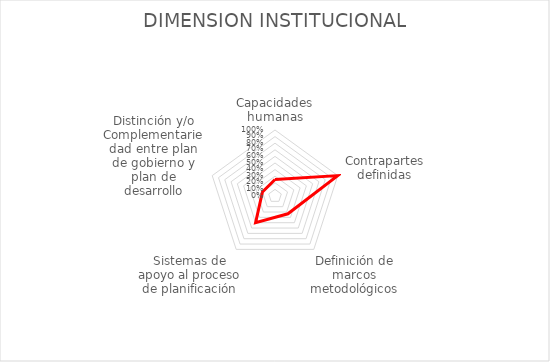
| Category | Series 0 |
|---|---|
| Capacidades humanas | 0.25 |
| Contrapartes definidas | 1 |
| Definición de marcos metodológicos | 0.333 |
| Sistemas de apoyo al proceso de planificación | 0.5 |
| Distinción y/o Complementariedad entre plan de gobierno y plan de desarrollo | 0.2 |